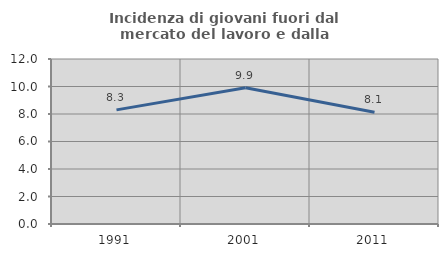
| Category | Incidenza di giovani fuori dal mercato del lavoro e dalla formazione  |
|---|---|
| 1991.0 | 8.299 |
| 2001.0 | 9.906 |
| 2011.0 | 8.122 |